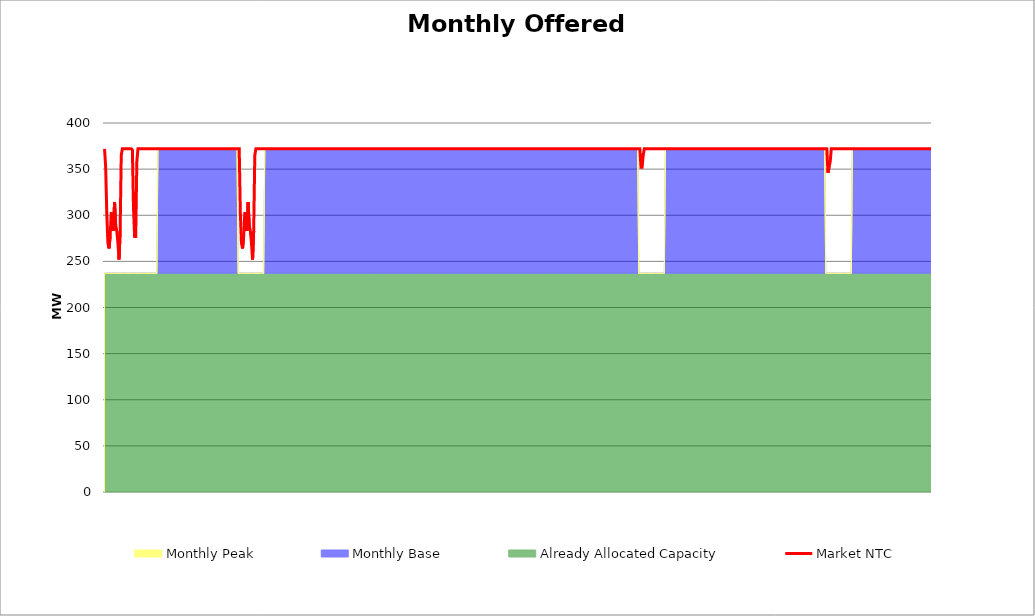
| Category | Market NTC |
|---|---|
| 0 | 372 |
| 1 | 352 |
| 2 | 302 |
| 3 | 270 |
| 4 | 264 |
| 5 | 277 |
| 6 | 302 |
| 7 | 302 |
| 8 | 283 |
| 9 | 314 |
| 10 | 289 |
| 11 | 283 |
| 12 | 270 |
| 13 | 252 |
| 14 | 283 |
| 15 | 365 |
| 16 | 372 |
| 17 | 372 |
| 18 | 372 |
| 19 | 372 |
| 20 | 372 |
| 21 | 372 |
| 22 | 372 |
| 23 | 372 |
| 24 | 372 |
| 25 | 371 |
| 26 | 308 |
| 27 | 277 |
| 28 | 277 |
| 29 | 358 |
| 30 | 372 |
| 31 | 372 |
| 32 | 372 |
| 33 | 372 |
| 34 | 372 |
| 35 | 372 |
| 36 | 372 |
| 37 | 372 |
| 38 | 372 |
| 39 | 372 |
| 40 | 372 |
| 41 | 372 |
| 42 | 372 |
| 43 | 372 |
| 44 | 372 |
| 45 | 372 |
| 46 | 372 |
| 47 | 372 |
| 48 | 372 |
| 49 | 372 |
| 50 | 372 |
| 51 | 372 |
| 52 | 372 |
| 53 | 372 |
| 54 | 372 |
| 55 | 372 |
| 56 | 372 |
| 57 | 372 |
| 58 | 372 |
| 59 | 372 |
| 60 | 372 |
| 61 | 372 |
| 62 | 372 |
| 63 | 372 |
| 64 | 372 |
| 65 | 372 |
| 66 | 372 |
| 67 | 372 |
| 68 | 372 |
| 69 | 372 |
| 70 | 372 |
| 71 | 372 |
| 72 | 372 |
| 73 | 372 |
| 74 | 372 |
| 75 | 372 |
| 76 | 372 |
| 77 | 372 |
| 78 | 372 |
| 79 | 372 |
| 80 | 372 |
| 81 | 372 |
| 82 | 372 |
| 83 | 372 |
| 84 | 372 |
| 85 | 372 |
| 86 | 372 |
| 87 | 372 |
| 88 | 372 |
| 89 | 372 |
| 90 | 372 |
| 91 | 372 |
| 92 | 372 |
| 93 | 372 |
| 94 | 372 |
| 95 | 372 |
| 96 | 372 |
| 97 | 372 |
| 98 | 372 |
| 99 | 372 |
| 100 | 372 |
| 101 | 372 |
| 102 | 372 |
| 103 | 372 |
| 104 | 372 |
| 105 | 372 |
| 106 | 372 |
| 107 | 372 |
| 108 | 372 |
| 109 | 372 |
| 110 | 372 |
| 111 | 372 |
| 112 | 372 |
| 113 | 372 |
| 114 | 372 |
| 115 | 372 |
| 116 | 372 |
| 117 | 372 |
| 118 | 372 |
| 119 | 372 |
| 120 | 372 |
| 121 | 372 |
| 122 | 303 |
| 123 | 270 |
| 124 | 264 |
| 125 | 277 |
| 126 | 302 |
| 127 | 302 |
| 128 | 283 |
| 129 | 314 |
| 130 | 289 |
| 131 | 283 |
| 132 | 270 |
| 133 | 252 |
| 134 | 283 |
| 135 | 365 |
| 136 | 372 |
| 137 | 372 |
| 138 | 372 |
| 139 | 372 |
| 140 | 372 |
| 141 | 372 |
| 142 | 372 |
| 143 | 372 |
| 144 | 372 |
| 145 | 372 |
| 146 | 372 |
| 147 | 372 |
| 148 | 372 |
| 149 | 372 |
| 150 | 372 |
| 151 | 372 |
| 152 | 372 |
| 153 | 372 |
| 154 | 372 |
| 155 | 372 |
| 156 | 372 |
| 157 | 372 |
| 158 | 372 |
| 159 | 372 |
| 160 | 372 |
| 161 | 372 |
| 162 | 372 |
| 163 | 372 |
| 164 | 372 |
| 165 | 372 |
| 166 | 372 |
| 167 | 372 |
| 168 | 372 |
| 169 | 372 |
| 170 | 372 |
| 171 | 372 |
| 172 | 372 |
| 173 | 372 |
| 174 | 372 |
| 175 | 372 |
| 176 | 372 |
| 177 | 372 |
| 178 | 372 |
| 179 | 372 |
| 180 | 372 |
| 181 | 372 |
| 182 | 372 |
| 183 | 372 |
| 184 | 372 |
| 185 | 372 |
| 186 | 372 |
| 187 | 372 |
| 188 | 372 |
| 189 | 372 |
| 190 | 372 |
| 191 | 372 |
| 192 | 372 |
| 193 | 372 |
| 194 | 372 |
| 195 | 372 |
| 196 | 372 |
| 197 | 372 |
| 198 | 372 |
| 199 | 372 |
| 200 | 372 |
| 201 | 372 |
| 202 | 372 |
| 203 | 372 |
| 204 | 372 |
| 205 | 372 |
| 206 | 372 |
| 207 | 372 |
| 208 | 372 |
| 209 | 372 |
| 210 | 372 |
| 211 | 372 |
| 212 | 372 |
| 213 | 372 |
| 214 | 372 |
| 215 | 372 |
| 216 | 372 |
| 217 | 372 |
| 218 | 372 |
| 219 | 372 |
| 220 | 372 |
| 221 | 372 |
| 222 | 372 |
| 223 | 372 |
| 224 | 372 |
| 225 | 372 |
| 226 | 372 |
| 227 | 372 |
| 228 | 372 |
| 229 | 372 |
| 230 | 372 |
| 231 | 372 |
| 232 | 372 |
| 233 | 372 |
| 234 | 372 |
| 235 | 372 |
| 236 | 372 |
| 237 | 372 |
| 238 | 372 |
| 239 | 372 |
| 240 | 372 |
| 241 | 372 |
| 242 | 372 |
| 243 | 372 |
| 244 | 372 |
| 245 | 372 |
| 246 | 372 |
| 247 | 372 |
| 248 | 372 |
| 249 | 372 |
| 250 | 372 |
| 251 | 372 |
| 252 | 372 |
| 253 | 372 |
| 254 | 372 |
| 255 | 372 |
| 256 | 372 |
| 257 | 372 |
| 258 | 372 |
| 259 | 372 |
| 260 | 372 |
| 261 | 372 |
| 262 | 372 |
| 263 | 372 |
| 264 | 372 |
| 265 | 372 |
| 266 | 372 |
| 267 | 372 |
| 268 | 372 |
| 269 | 372 |
| 270 | 372 |
| 271 | 372 |
| 272 | 372 |
| 273 | 372 |
| 274 | 372 |
| 275 | 372 |
| 276 | 372 |
| 277 | 372 |
| 278 | 372 |
| 279 | 372 |
| 280 | 372 |
| 281 | 372 |
| 282 | 372 |
| 283 | 372 |
| 284 | 372 |
| 285 | 372 |
| 286 | 372 |
| 287 | 372 |
| 288 | 372 |
| 289 | 372 |
| 290 | 372 |
| 291 | 372 |
| 292 | 372 |
| 293 | 372 |
| 294 | 372 |
| 295 | 372 |
| 296 | 372 |
| 297 | 372 |
| 298 | 372 |
| 299 | 372 |
| 300 | 372 |
| 301 | 372 |
| 302 | 372 |
| 303 | 372 |
| 304 | 372 |
| 305 | 372 |
| 306 | 372 |
| 307 | 372 |
| 308 | 372 |
| 309 | 372 |
| 310 | 372 |
| 311 | 372 |
| 312 | 372 |
| 313 | 372 |
| 314 | 372 |
| 315 | 372 |
| 316 | 372 |
| 317 | 372 |
| 318 | 372 |
| 319 | 372 |
| 320 | 372 |
| 321 | 372 |
| 322 | 372 |
| 323 | 372 |
| 324 | 372 |
| 325 | 372 |
| 326 | 372 |
| 327 | 372 |
| 328 | 372 |
| 329 | 372 |
| 330 | 372 |
| 331 | 372 |
| 332 | 372 |
| 333 | 372 |
| 334 | 372 |
| 335 | 372 |
| 336 | 372 |
| 337 | 372 |
| 338 | 372 |
| 339 | 372 |
| 340 | 372 |
| 341 | 372 |
| 342 | 372 |
| 343 | 372 |
| 344 | 372 |
| 345 | 372 |
| 346 | 372 |
| 347 | 372 |
| 348 | 372 |
| 349 | 372 |
| 350 | 372 |
| 351 | 372 |
| 352 | 372 |
| 353 | 372 |
| 354 | 372 |
| 355 | 372 |
| 356 | 372 |
| 357 | 372 |
| 358 | 372 |
| 359 | 372 |
| 360 | 372 |
| 361 | 372 |
| 362 | 372 |
| 363 | 372 |
| 364 | 372 |
| 365 | 372 |
| 366 | 372 |
| 367 | 372 |
| 368 | 372 |
| 369 | 372 |
| 370 | 372 |
| 371 | 372 |
| 372 | 372 |
| 373 | 372 |
| 374 | 372 |
| 375 | 372 |
| 376 | 372 |
| 377 | 372 |
| 378 | 372 |
| 379 | 372 |
| 380 | 372 |
| 381 | 372 |
| 382 | 372 |
| 383 | 372 |
| 384 | 372 |
| 385 | 372 |
| 386 | 372 |
| 387 | 372 |
| 388 | 372 |
| 389 | 372 |
| 390 | 372 |
| 391 | 372 |
| 392 | 372 |
| 393 | 372 |
| 394 | 372 |
| 395 | 372 |
| 396 | 372 |
| 397 | 372 |
| 398 | 372 |
| 399 | 372 |
| 400 | 372 |
| 401 | 372 |
| 402 | 372 |
| 403 | 372 |
| 404 | 372 |
| 405 | 372 |
| 406 | 372 |
| 407 | 372 |
| 408 | 372 |
| 409 | 372 |
| 410 | 372 |
| 411 | 372 |
| 412 | 372 |
| 413 | 372 |
| 414 | 372 |
| 415 | 372 |
| 416 | 372 |
| 417 | 372 |
| 418 | 372 |
| 419 | 372 |
| 420 | 372 |
| 421 | 372 |
| 422 | 372 |
| 423 | 372 |
| 424 | 372 |
| 425 | 372 |
| 426 | 372 |
| 427 | 372 |
| 428 | 372 |
| 429 | 372 |
| 430 | 372 |
| 431 | 372 |
| 432 | 372 |
| 433 | 372 |
| 434 | 372 |
| 435 | 372 |
| 436 | 372 |
| 437 | 372 |
| 438 | 372 |
| 439 | 372 |
| 440 | 372 |
| 441 | 372 |
| 442 | 372 |
| 443 | 372 |
| 444 | 372 |
| 445 | 372 |
| 446 | 372 |
| 447 | 372 |
| 448 | 372 |
| 449 | 372 |
| 450 | 372 |
| 451 | 372 |
| 452 | 372 |
| 453 | 372 |
| 454 | 372 |
| 455 | 372 |
| 456 | 372 |
| 457 | 372 |
| 458 | 372 |
| 459 | 372 |
| 460 | 372 |
| 461 | 372 |
| 462 | 372 |
| 463 | 372 |
| 464 | 372 |
| 465 | 372 |
| 466 | 372 |
| 467 | 372 |
| 468 | 372 |
| 469 | 372 |
| 470 | 372 |
| 471 | 372 |
| 472 | 372 |
| 473 | 372 |
| 474 | 372 |
| 475 | 372 |
| 476 | 372 |
| 477 | 372 |
| 478 | 372 |
| 479 | 372 |
| 480 | 372 |
| 481 | 372 |
| 482 | 352 |
| 483 | 352 |
| 484 | 365 |
| 485 | 372 |
| 486 | 372 |
| 487 | 372 |
| 488 | 372 |
| 489 | 372 |
| 490 | 372 |
| 491 | 372 |
| 492 | 372 |
| 493 | 372 |
| 494 | 372 |
| 495 | 372 |
| 496 | 372 |
| 497 | 372 |
| 498 | 372 |
| 499 | 372 |
| 500 | 372 |
| 501 | 372 |
| 502 | 372 |
| 503 | 372 |
| 504 | 372 |
| 505 | 372 |
| 506 | 372 |
| 507 | 372 |
| 508 | 372 |
| 509 | 372 |
| 510 | 372 |
| 511 | 372 |
| 512 | 372 |
| 513 | 372 |
| 514 | 372 |
| 515 | 372 |
| 516 | 372 |
| 517 | 372 |
| 518 | 372 |
| 519 | 372 |
| 520 | 372 |
| 521 | 372 |
| 522 | 372 |
| 523 | 372 |
| 524 | 372 |
| 525 | 372 |
| 526 | 372 |
| 527 | 372 |
| 528 | 372 |
| 529 | 372 |
| 530 | 372 |
| 531 | 372 |
| 532 | 372 |
| 533 | 372 |
| 534 | 372 |
| 535 | 372 |
| 536 | 372 |
| 537 | 372 |
| 538 | 372 |
| 539 | 372 |
| 540 | 372 |
| 541 | 372 |
| 542 | 372 |
| 543 | 372 |
| 544 | 372 |
| 545 | 372 |
| 546 | 372 |
| 547 | 372 |
| 548 | 372 |
| 549 | 372 |
| 550 | 372 |
| 551 | 372 |
| 552 | 372 |
| 553 | 372 |
| 554 | 372 |
| 555 | 372 |
| 556 | 372 |
| 557 | 372 |
| 558 | 372 |
| 559 | 372 |
| 560 | 372 |
| 561 | 372 |
| 562 | 372 |
| 563 | 372 |
| 564 | 372 |
| 565 | 372 |
| 566 | 372 |
| 567 | 372 |
| 568 | 372 |
| 569 | 372 |
| 570 | 372 |
| 571 | 372 |
| 572 | 372 |
| 573 | 372 |
| 574 | 372 |
| 575 | 372 |
| 576 | 372 |
| 577 | 372 |
| 578 | 372 |
| 579 | 372 |
| 580 | 372 |
| 581 | 372 |
| 582 | 372 |
| 583 | 372 |
| 584 | 372 |
| 585 | 372 |
| 586 | 372 |
| 587 | 372 |
| 588 | 372 |
| 589 | 372 |
| 590 | 372 |
| 591 | 372 |
| 592 | 372 |
| 593 | 372 |
| 594 | 372 |
| 595 | 372 |
| 596 | 372 |
| 597 | 372 |
| 598 | 372 |
| 599 | 372 |
| 600 | 372 |
| 601 | 372 |
| 602 | 372 |
| 603 | 372 |
| 604 | 372 |
| 605 | 372 |
| 606 | 372 |
| 607 | 372 |
| 608 | 372 |
| 609 | 372 |
| 610 | 372 |
| 611 | 372 |
| 612 | 372 |
| 613 | 372 |
| 614 | 372 |
| 615 | 372 |
| 616 | 372 |
| 617 | 372 |
| 618 | 372 |
| 619 | 372 |
| 620 | 372 |
| 621 | 372 |
| 622 | 372 |
| 623 | 372 |
| 624 | 372 |
| 625 | 372 |
| 626 | 372 |
| 627 | 372 |
| 628 | 372 |
| 629 | 372 |
| 630 | 372 |
| 631 | 372 |
| 632 | 372 |
| 633 | 372 |
| 634 | 372 |
| 635 | 372 |
| 636 | 372 |
| 637 | 372 |
| 638 | 372 |
| 639 | 372 |
| 640 | 372 |
| 641 | 372 |
| 642 | 372 |
| 643 | 372 |
| 644 | 372 |
| 645 | 372 |
| 646 | 372 |
| 647 | 372 |
| 648 | 372 |
| 649 | 372 |
| 650 | 346 |
| 651 | 352 |
| 652 | 358 |
| 653 | 372 |
| 654 | 372 |
| 655 | 372 |
| 656 | 372 |
| 657 | 372 |
| 658 | 372 |
| 659 | 372 |
| 660 | 372 |
| 661 | 372 |
| 662 | 372 |
| 663 | 372 |
| 664 | 372 |
| 665 | 372 |
| 666 | 372 |
| 667 | 372 |
| 668 | 372 |
| 669 | 372 |
| 670 | 372 |
| 671 | 372 |
| 672 | 372 |
| 673 | 372 |
| 674 | 372 |
| 675 | 372 |
| 676 | 372 |
| 677 | 372 |
| 678 | 372 |
| 679 | 372 |
| 680 | 372 |
| 681 | 372 |
| 682 | 372 |
| 683 | 372 |
| 684 | 372 |
| 685 | 372 |
| 686 | 372 |
| 687 | 372 |
| 688 | 372 |
| 689 | 372 |
| 690 | 372 |
| 691 | 372 |
| 692 | 372 |
| 693 | 372 |
| 694 | 372 |
| 695 | 372 |
| 696 | 372 |
| 697 | 372 |
| 698 | 372 |
| 699 | 372 |
| 700 | 372 |
| 701 | 372 |
| 702 | 372 |
| 703 | 372 |
| 704 | 372 |
| 705 | 372 |
| 706 | 372 |
| 707 | 372 |
| 708 | 372 |
| 709 | 372 |
| 710 | 372 |
| 711 | 372 |
| 712 | 372 |
| 713 | 372 |
| 714 | 372 |
| 715 | 372 |
| 716 | 372 |
| 717 | 372 |
| 718 | 372 |
| 719 | 372 |
| 720 | 372 |
| 721 | 372 |
| 722 | 372 |
| 723 | 372 |
| 724 | 372 |
| 725 | 372 |
| 726 | 372 |
| 727 | 372 |
| 728 | 372 |
| 729 | 372 |
| 730 | 372 |
| 731 | 372 |
| 732 | 372 |
| 733 | 372 |
| 734 | 372 |
| 735 | 372 |
| 736 | 372 |
| 737 | 372 |
| 738 | 372 |
| 739 | 372 |
| 740 | 372 |
| 741 | 372 |
| 742 | 372 |
| 743 | 372 |